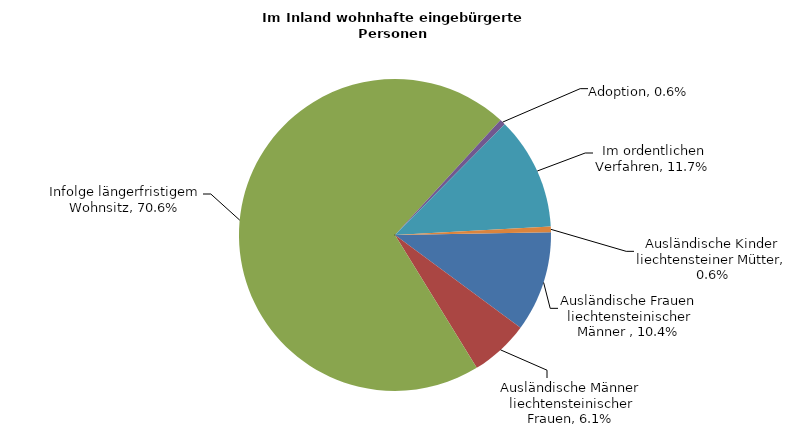
| Category | Series 0 |
|---|---|
| Ausländische Frauen liechtensteinischer Männer  | 0.104 |
| Ausländische Männer liechtensteinischer Frauen | 0.061 |
| Infolge längerfristigem Wohnsitz | 0.706 |
| Adoption | 0.006 |
| Im ordentlichen Verfahren | 0.117 |
| Ausländische Kinder liechtensteiner Mütter | 0.006 |